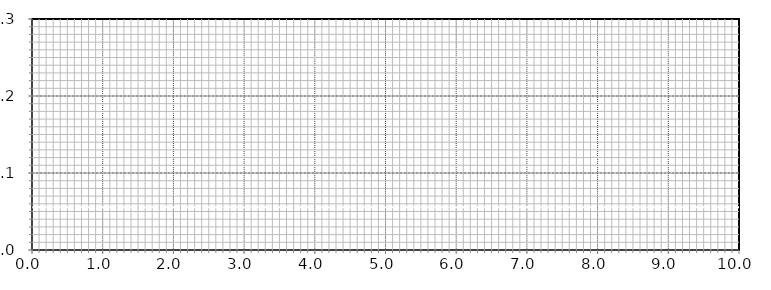
| Category | Series 6 |
|---|---|
| 0.0 | 0.055 |
| 10.0 | 0.055 |